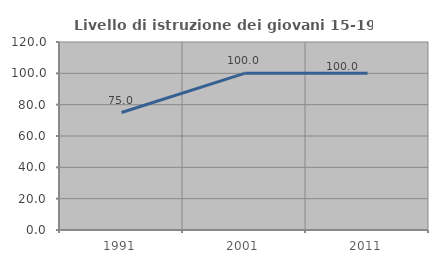
| Category | Livello di istruzione dei giovani 15-19 anni |
|---|---|
| 1991.0 | 75 |
| 2001.0 | 100 |
| 2011.0 | 100 |